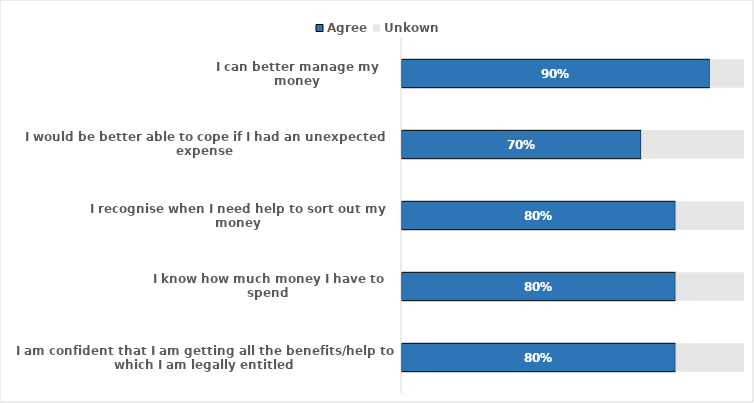
| Category | Agree | Unkown |
|---|---|---|
| I am confident that I am getting all the benefits/help to which I am legally entitled | 0.8 | 0.2 |
| I know how much money I have to spend | 0.8 | 0.2 |
| I recognise when I need help to sort out my money | 0.8 | 0.2 |
| I would be better able to cope if I had an unexpected expense | 0.7 | 0.3 |
| I can better manage my money | 0.9 | 0.1 |